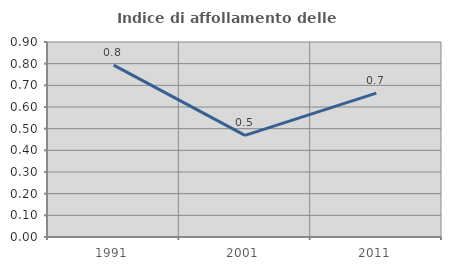
| Category | Indice di affollamento delle abitazioni  |
|---|---|
| 1991.0 | 0.793 |
| 2001.0 | 0.469 |
| 2011.0 | 0.664 |